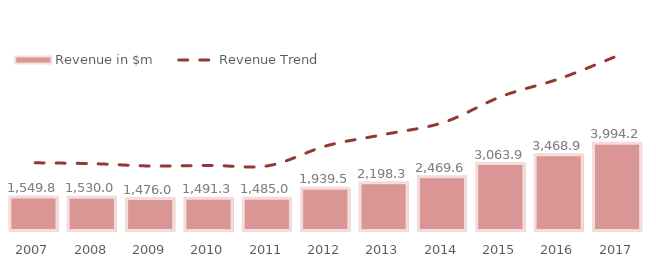
| Category | Revenue in $m |
|---|---|
| 2007.0 | 1549800 |
| 2008.0 | 1530000 |
| 2009.0 | 1476000 |
| 2010.0 | 1491300 |
| 2011.0 | 1485000 |
| 2012.0 | 1939512.375 |
| 2013.0 | 2198340 |
| 2014.0 | 2469550.882 |
| 2015.0 | 3063923.438 |
| 2016.0 | 3468906 |
| 2017.0 | 3994244.5 |